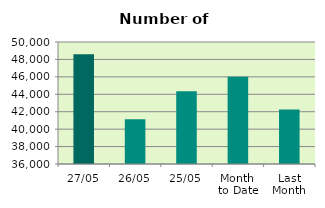
| Category | Series 0 |
|---|---|
| 27/05 | 48592 |
| 26/05 | 41134 |
| 25/05 | 44350 |
| Month 
to Date | 46006 |
| Last
Month | 42252.3 |